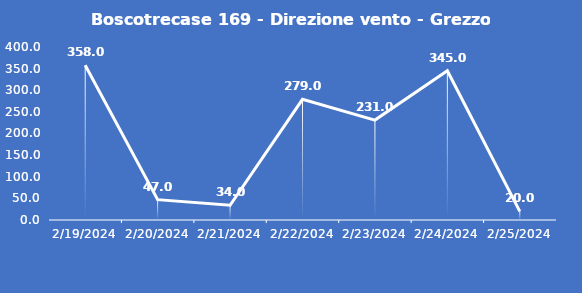
| Category | Boscotrecase 169 - Direzione vento - Grezzo (°N) |
|---|---|
| 2/19/24 | 358 |
| 2/20/24 | 47 |
| 2/21/24 | 34 |
| 2/22/24 | 279 |
| 2/23/24 | 231 |
| 2/24/24 | 345 |
| 2/25/24 | 20 |